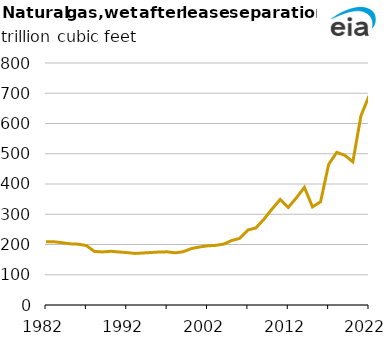
| Category | Natural gas, wet after lease separation proved reserves (trillion cubic feet) |
|---|---|
| 1982.0 | 209.254 |
| 1983.0 | 209.046 |
| 1984.0 | 205.984 |
| 1985.0 | 202.202 |
| 1986.0 | 201.109 |
| 1987.0 | 196.428 |
| 1988.0 | 176.999 |
| 1989.0 | 175.428 |
| 1990.0 | 177.576 |
| 1991.0 | 175.325 |
| 1992.0 | 173.309 |
| 1993.0 | 170.49 |
| 1994.0 | 171.939 |
| 1995.0 | 173.476 |
| 1996.0 | 175.147 |
| 1997.0 | 175.721 |
| 1998.0 | 172.443 |
| 1999.0 | 176.159 |
| 2000.0 | 186.51 |
| 2001.0 | 191.743 |
| 2002.0 | 195.561 |
| 2003.0 | 197.145 |
| 2004.0 | 201.2 |
| 2005.0 | 213.308 |
| 2006.0 | 220.416 |
| 2007.0 | 247.789 |
| 2008.0 | 255.035 |
| 2009.0 | 283.879 |
| 2010.0 | 317.647 |
| 2011.0 | 348.809 |
| 2012.0 | 322.67 |
| 2013.0 | 353.994 |
| 2014.0 | 388.841 |
| 2015.0 | 324.303 |
| 2016.0 | 341.133 |
| 2017.0 | 464.292 |
| 2018.0 | 504.501 |
| 2019.0 | 494.911 |
| 2020.0 | 473.285 |
| 2021.0 | 625.373 |
| 2022.0 | 691.025 |